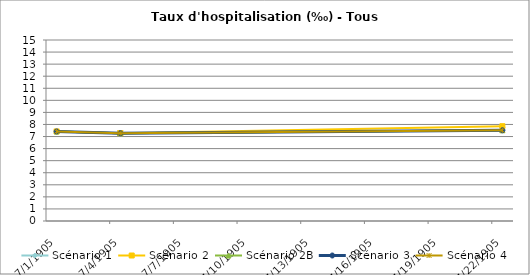
| Category | Scénario 1 | Scénario 2 | Scénario 2B | Scénario 3 | Scénario 4 |
|---|---|---|---|---|---|
| 2009.0 | 7.421 | 7.421 | 7.421 | 7.421 | 7.421 |
| 2012.0 | 7.282 | 7.282 | 7.282 | 7.282 | 7.282 |
| 2030.0 | 7.518 | 7.857 | 7.518 | 7.518 | 7.518 |